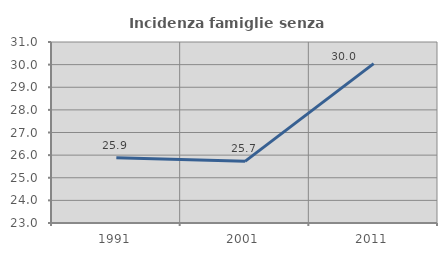
| Category | Incidenza famiglie senza nuclei |
|---|---|
| 1991.0 | 25.888 |
| 2001.0 | 25.726 |
| 2011.0 | 30.042 |